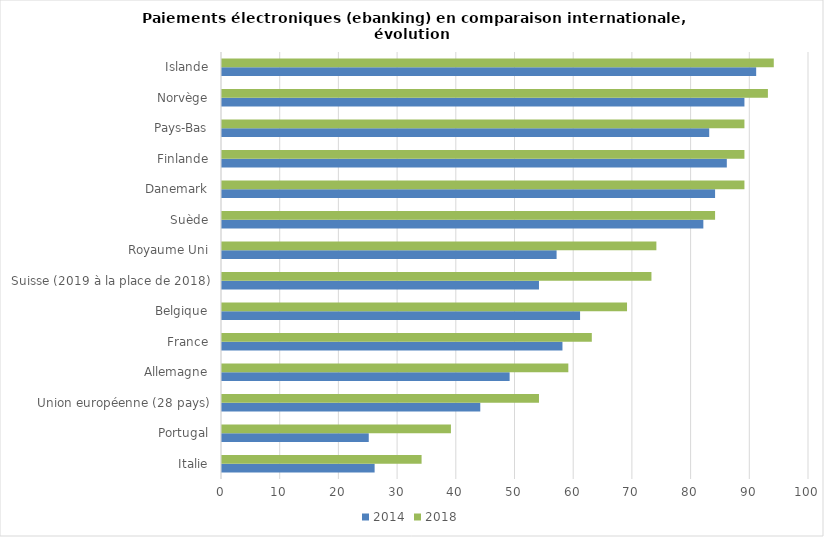
| Category | 2014 | 2018 |
|---|---|---|
| Italie | 26 | 34 |
| Portugal | 25 | 39 |
| Union européenne (28 pays) | 44 | 54 |
| Allemagne | 49 | 59 |
| France | 58 | 63 |
| Belgique | 61 | 69 |
| Suisse (2019 à la place de 2018) | 54 | 73.16 |
| Royaume Uni | 57 | 74 |
| Suède | 82 | 84 |
| Danemark | 84 | 89 |
| Finlande | 86 | 89 |
| Pays-Bas | 83 | 89 |
| Norvège | 89 | 93 |
| Islande | 91 | 94 |